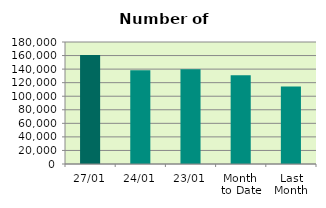
| Category | Series 0 |
|---|---|
| 27/01 | 160904 |
| 24/01 | 138230 |
| 23/01 | 139824 |
| Month 
to Date | 130814.222 |
| Last
Month | 114459.3 |